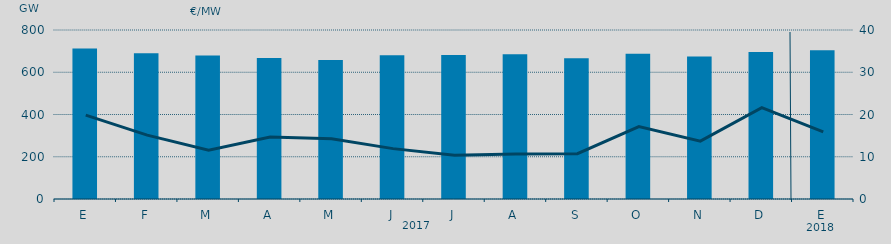
| Category | Energia (MWh) a subir |
|---|---|
| E | 712.52 |
| F | 690.067 |
| M | 679.79 |
| A | 667.793 |
| M | 657.634 |
| J | 680.754 |
| J | 681.722 |
| A | 685.083 |
| S | 666.501 |
| O | 686.996 |
| N | 674.335 |
| D | 695.754 |
| E | 703.828 |